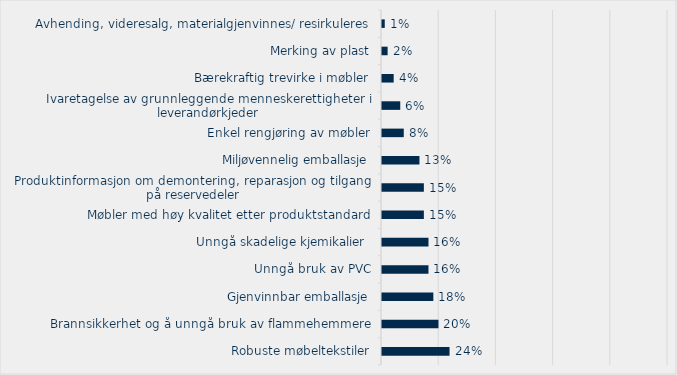
| Category | Prosent |
|---|---|
| Robuste møbeltekstiler | 0.236 |
| Brannsikkerhet og å unngå bruk av flammehemmere | 0.197 |
| Gjenvinnbar emballasje | 0.179 |
| Unngå bruk av PVC | 0.163 |
| Unngå skadelige kjemikalier  | 0.162 |
| Møbler med høy kvalitet etter produktstandard | 0.146 |
| Produktinformasjon om demontering, reparasjon og tilgang på reservedeler | 0.146 |
| Miljøvennelig emballasje | 0.131 |
| Enkel rengjøring av møbler | 0.076 |
| Ivaretagelse av grunnleggende menneskerettigheter i leverandørkjeder | 0.064 |
| Bærekraftig trevirke i møbler | 0.041 |
| Merking av plast | 0.02 |
| Avhending, videresalg, materialgjenvinnes/ resirkuleres | 0.01 |